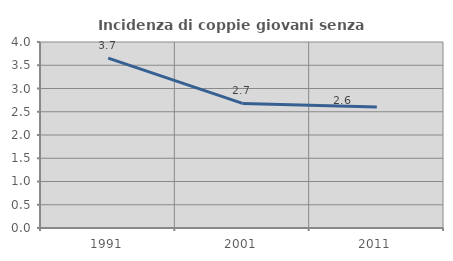
| Category | Incidenza di coppie giovani senza figli |
|---|---|
| 1991.0 | 3.653 |
| 2001.0 | 2.68 |
| 2011.0 | 2.601 |